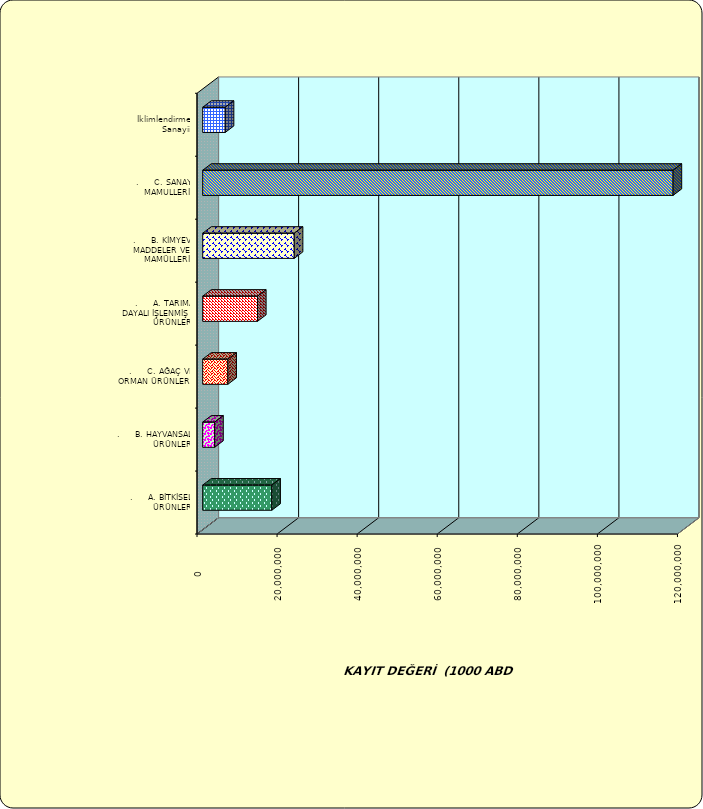
| Category | Series 0 |
|---|---|
| .     A. BİTKİSEL ÜRÜNLER | 17262395.385 |
| .     B. HAYVANSAL ÜRÜNLER | 2993144.117 |
| .     C. AĞAÇ VE ORMAN ÜRÜNLERİ | 6280866.733 |
| .     A. TARIMA DAYALI İŞLENMİŞ ÜRÜNLER | 13686385.228 |
| .     B. KİMYEVİ MADDELER VE MAMÜLLERİ | 22867329.819 |
| .     C. SANAYİ MAMULLERİ | 117483393.655 |
|  İklimlendirme Sanayii | 5626116.38 |